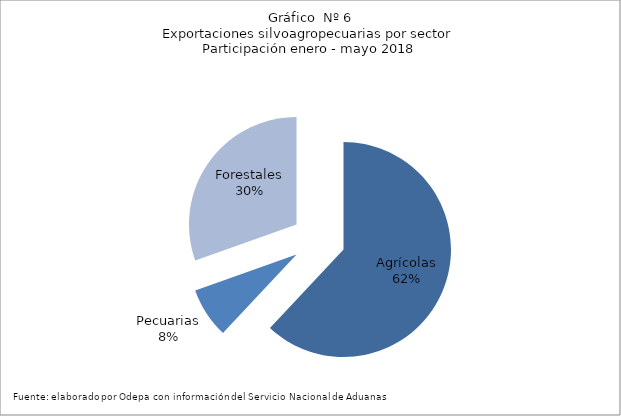
| Category | Series 0 |
|---|---|
| Agrícolas | 4948569 |
| Pecuarias | 605606 |
| Forestales | 2429257 |